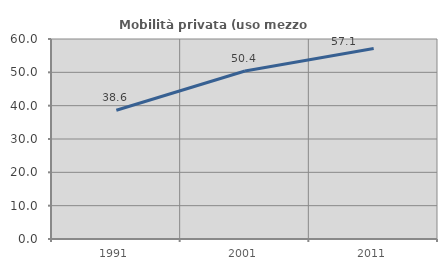
| Category | Mobilità privata (uso mezzo privato) |
|---|---|
| 1991.0 | 38.624 |
| 2001.0 | 50.407 |
| 2011.0 | 57.143 |